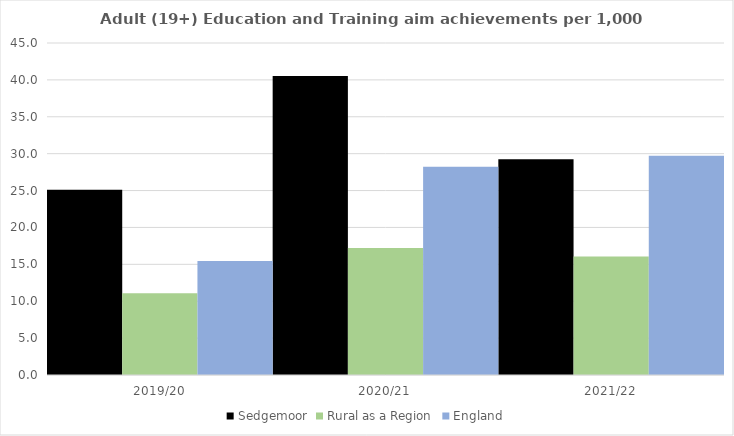
| Category | Sedgemoor | Rural as a Region | England |
|---|---|---|---|
| 2019/20 | 25.117 | 11.081 | 15.446 |
| 2020/21 | 40.519 | 17.224 | 28.211 |
| 2021/22 | 29.254 | 16.063 | 29.711 |